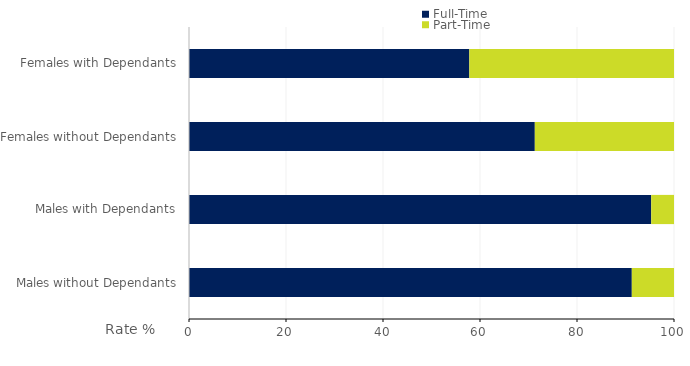
| Category | Full-Time | Part-Time |
|---|---|---|
| Males without Dependants | 91.3 | 8.7 |
| Males with Dependants | 95.3 | 4.7 |
| Females without Dependants | 71.3 | 28.7 |
| Females with Dependants | 57.8 | 42.2 |